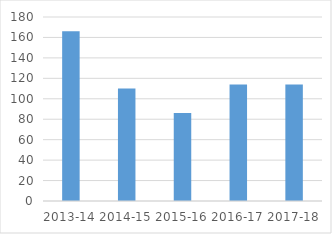
| Category | Series 0 |
|---|---|
| 2013-14 | 166 |
| 2014-15 | 110 |
| 2015-16 | 86 |
| 2016-17 | 114 |
| 2017-18 | 114 |